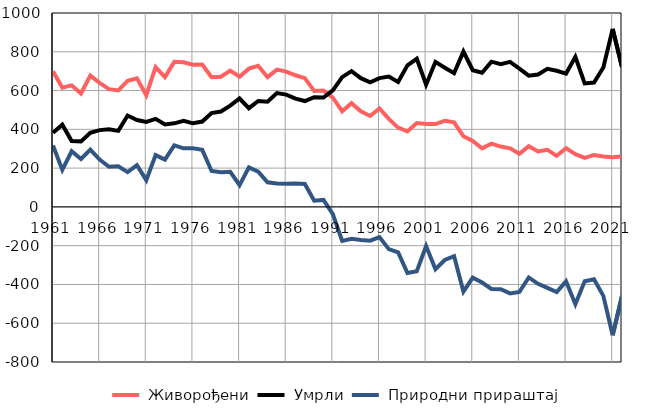
| Category |  Живорођени |  Умрли |  Природни прираштај |
|---|---|---|---|
| 1961.0 | 699 | 382 | 317 |
| 1962.0 | 615 | 424 | 191 |
| 1963.0 | 627 | 340 | 287 |
| 1964.0 | 585 | 338 | 247 |
| 1965.0 | 677 | 382 | 295 |
| 1966.0 | 640 | 396 | 244 |
| 1967.0 | 607 | 400 | 207 |
| 1968.0 | 601 | 392 | 209 |
| 1969.0 | 650 | 471 | 179 |
| 1970.0 | 663 | 448 | 215 |
| 1971.0 | 576 | 438 | 138 |
| 1972.0 | 721 | 454 | 267 |
| 1973.0 | 669 | 425 | 244 |
| 1974.0 | 748 | 431 | 317 |
| 1975.0 | 746 | 444 | 302 |
| 1976.0 | 733 | 431 | 302 |
| 1977.0 | 734 | 440 | 294 |
| 1978.0 | 669 | 484 | 185 |
| 1979.0 | 671 | 492 | 179 |
| 1980.0 | 703 | 522 | 181 |
| 1981.0 | 671 | 559 | 112 |
| 1982.0 | 713 | 509 | 204 |
| 1983.0 | 728 | 546 | 182 |
| 1984.0 | 669 | 542 | 127 |
| 1985.0 | 708 | 587 | 121 |
| 1986.0 | 698 | 579 | 119 |
| 1987.0 | 679 | 558 | 121 |
| 1988.0 | 664 | 546 | 118 |
| 1989.0 | 598 | 566 | 32 |
| 1990.0 | 600 | 564 | 36 |
| 1991.0 | 564 | 601 | -37 |
| 1992.0 | 493 | 669 | -176 |
| 1993.0 | 535 | 700 | -165 |
| 1994.0 | 493 | 664 | -171 |
| 1995.0 | 469 | 643 | -174 |
| 1996.0 | 508 | 664 | -156 |
| 1997.0 | 454 | 672 | -218 |
| 1998.0 | 409 | 644 | -235 |
| 1999.0 | 389 | 730 | -341 |
| 2000.0 | 432 | 764 | -332 |
| 2001.0 | 428 | 630 | -202 |
| 2002.0 | 427 | 748 | -321 |
| 2003.0 | 444 | 718 | -274 |
| 2004.0 | 436 | 690 | -254 |
| 2005.0 | 364 | 801 | -437 |
| 2006.0 | 340 | 705 | -365 |
| 2007.0 | 302 | 692 | -390 |
| 2008.0 | 326 | 749 | -423 |
| 2009.0 | 311 | 736 | -425 |
| 2010.0 | 302 | 748 | -446 |
| 2011.0 | 274 | 713 | -439 |
| 2012.0 | 313 | 677 | -364 |
| 2013.0 | 286 | 683 | -397 |
| 2014.0 | 294 | 712 | -418 |
| 2015.0 | 263 | 702 | -439 |
| 2016.0 | 303 | 687 | -384 |
| 2017.0 | 272 | 774 | -502 |
| 2018.0 | 253 | 637 | -384 |
| 2019.0 | 268 | 641 | -373 |
| 2020.0 | 260 | 719 | -459 |
| 2021.0 | 256 | 918 | -662 |
| 2022.0 | 261 | 721 | -460 |